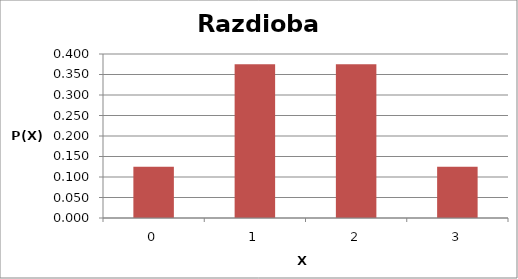
| Category | Series 0 |
|---|---|
| 0.0 | 0.125 |
| 1.0 | 0.375 |
| 2.0 | 0.375 |
| 3.0 | 0.125 |